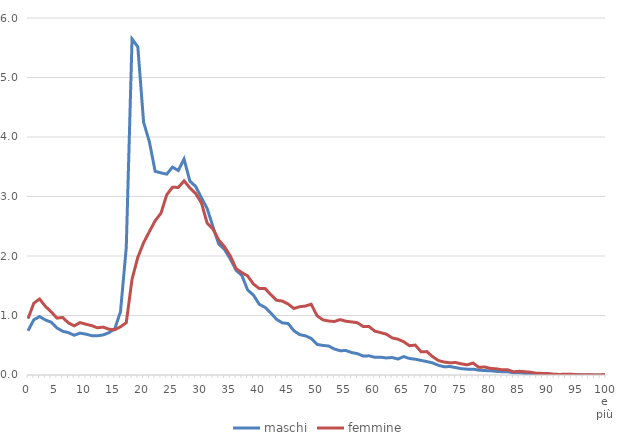
| Category | maschi | femmine |
|---|---|---|
| 0 | 0.744 | 0.946 |
| 1 | 0.928 | 1.206 |
| 2 | 0.982 | 1.278 |
| 3 | 0.925 | 1.155 |
| 4 | 0.888 | 1.063 |
| 5 | 0.791 | 0.957 |
| 6 | 0.735 | 0.966 |
| 7 | 0.712 | 0.875 |
| 8 | 0.668 | 0.826 |
| 9 | 0.704 | 0.881 |
| 10 | 0.687 | 0.854 |
| 11 | 0.662 | 0.831 |
| 12 | 0.66 | 0.794 |
| 13 | 0.673 | 0.805 |
| 14 | 0.711 | 0.77 |
| 15 | 0.775 | 0.76 |
| 16 | 1.061 | 0.81 |
| 17 | 2.143 | 0.879 |
| 18 | 5.647 | 1.61 |
| 19 | 5.514 | 1.978 |
| 20 | 4.248 | 2.223 |
| 21 | 3.92 | 2.411 |
| 22 | 3.424 | 2.592 |
| 23 | 3.398 | 2.719 |
| 24 | 3.376 | 3.027 |
| 25 | 3.494 | 3.156 |
| 26 | 3.437 | 3.152 |
| 27 | 3.63 | 3.263 |
| 28 | 3.26 | 3.145 |
| 29 | 3.17 | 3.051 |
| 30 | 2.981 | 2.893 |
| 31 | 2.797 | 2.551 |
| 32 | 2.493 | 2.454 |
| 33 | 2.202 | 2.268 |
| 34 | 2.11 | 2.156 |
| 35 | 1.95 | 2.001 |
| 36 | 1.76 | 1.788 |
| 37 | 1.674 | 1.721 |
| 38 | 1.429 | 1.665 |
| 39 | 1.344 | 1.529 |
| 40 | 1.189 | 1.454 |
| 41 | 1.137 | 1.454 |
| 42 | 1.043 | 1.351 |
| 43 | 0.935 | 1.256 |
| 44 | 0.876 | 1.243 |
| 45 | 0.865 | 1.193 |
| 46 | 0.744 | 1.118 |
| 47 | 0.679 | 1.148 |
| 48 | 0.658 | 1.159 |
| 49 | 0.616 | 1.19 |
| 50 | 0.515 | 0.997 |
| 51 | 0.497 | 0.928 |
| 52 | 0.488 | 0.907 |
| 53 | 0.437 | 0.899 |
| 54 | 0.408 | 0.931 |
| 55 | 0.411 | 0.903 |
| 56 | 0.377 | 0.892 |
| 57 | 0.358 | 0.878 |
| 58 | 0.318 | 0.814 |
| 59 | 0.322 | 0.815 |
| 60 | 0.298 | 0.737 |
| 61 | 0.298 | 0.712 |
| 62 | 0.287 | 0.686 |
| 63 | 0.294 | 0.624 |
| 64 | 0.268 | 0.602 |
| 65 | 0.309 | 0.559 |
| 66 | 0.278 | 0.493 |
| 67 | 0.266 | 0.502 |
| 68 | 0.246 | 0.391 |
| 69 | 0.226 | 0.393 |
| 70 | 0.204 | 0.309 |
| 71 | 0.163 | 0.243 |
| 72 | 0.138 | 0.217 |
| 73 | 0.143 | 0.205 |
| 74 | 0.124 | 0.21 |
| 75 | 0.106 | 0.186 |
| 76 | 0.098 | 0.171 |
| 77 | 0.099 | 0.201 |
| 78 | 0.082 | 0.129 |
| 79 | 0.074 | 0.134 |
| 80 | 0.072 | 0.111 |
| 81 | 0.061 | 0.105 |
| 82 | 0.056 | 0.088 |
| 83 | 0.054 | 0.088 |
| 84 | 0.037 | 0.054 |
| 85 | 0.04 | 0.062 |
| 86 | 0.025 | 0.055 |
| 87 | 0.023 | 0.046 |
| 88 | 0.018 | 0.029 |
| 89 | 0.011 | 0.027 |
| 90 | 0.007 | 0.024 |
| 91 | 0.008 | 0.013 |
| 92 | 0.004 | 0.009 |
| 93 | 0.002 | 0.015 |
| 94 | 0.002 | 0.013 |
| 95 | 0.004 | 0.005 |
| 96 | 0 | 0.002 |
| 97 | 0.002 | 0.004 |
| 98 | 0 | 0.001 |
| 99 | 0.001 | 0.001 |
| 100 e più | 0.002 | 0.007 |